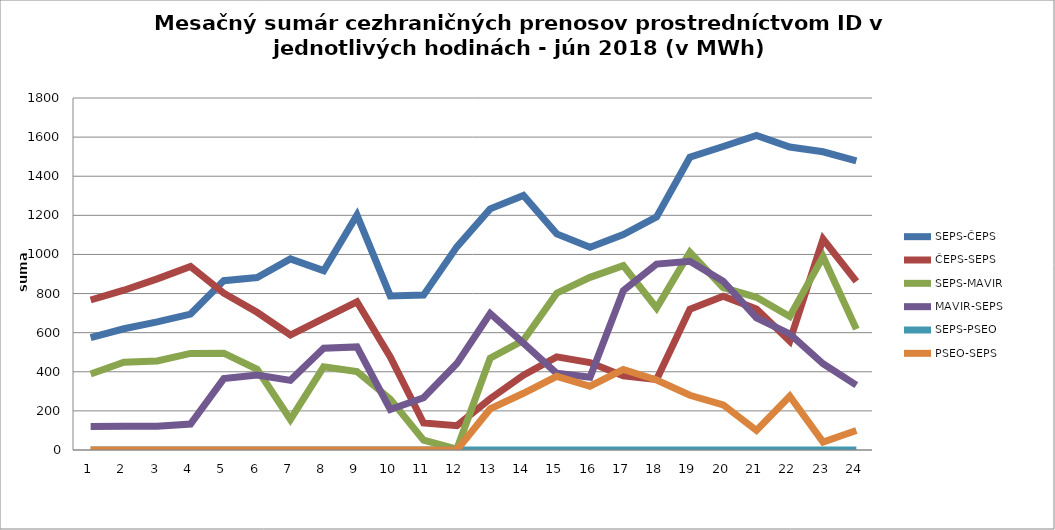
| Category | SEPS-ČEPS | ČEPS-SEPS | SEPS-MAVIR | MAVIR-SEPS | SEPS-PSEO | PSEO-SEPS |
|---|---|---|---|---|---|---|
| 1.0 | 575 | 767 | 389 | 120 | 0 | 0 |
| 2.0 | 620 | 817 | 449 | 122 | 0 | 0 |
| 3.0 | 655 | 875 | 455 | 122 | 0 | 0 |
| 4.0 | 695 | 938 | 494 | 133 | 0 | 0 |
| 5.0 | 866 | 802 | 495 | 365 | 0 | 0 |
| 6.0 | 882 | 704 | 413 | 383 | 0 | 0 |
| 7.0 | 977 | 588 | 156 | 356 | 0 | 0 |
| 8.0 | 917 | 673 | 425 | 520 | 0 | 0 |
| 9.0 | 1201 | 758 | 401 | 527 | 0 | 0 |
| 10.0 | 788 | 476 | 260 | 207 | 0 | 0 |
| 11.0 | 792 | 138 | 50 | 267 | 0 | 0 |
| 12.0 | 1039 | 124 | 5 | 442 | 0 | 0 |
| 13.0 | 1233 | 262 | 469 | 698 | 0 | 210 |
| 14.0 | 1302 | 383 | 561 | 547 | 0 | 290 |
| 15.0 | 1105 | 476 | 802 | 392 | 0 | 377 |
| 16.0 | 1037 | 447 | 883 | 372 | 0 | 326 |
| 17.0 | 1102 | 379 | 943 | 815 | 0 | 412 |
| 18.0 | 1192 | 361 | 726 | 951 | 0 | 358 |
| 19.0 | 1497 | 720 | 1011 | 965 | 0 | 280 |
| 20.0 | 1552 | 786 | 830 | 863 | 0 | 231 |
| 21.0 | 1609 | 721 | 781 | 676 | 0 | 100 |
| 22.0 | 1549 | 557 | 683 | 594 | 0 | 275 |
| 23.0 | 1525 | 1079 | 988 | 441 | 0 | 41 |
| 24.0 | 1478 | 862 | 618 | 332 | 0 | 100 |